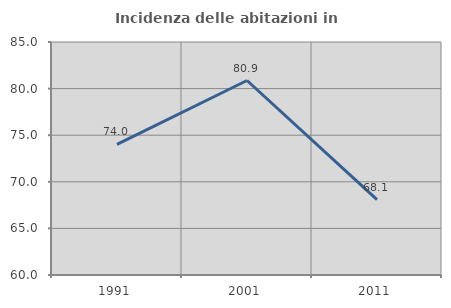
| Category | Incidenza delle abitazioni in proprietà  |
|---|---|
| 1991.0 | 74.017 |
| 2001.0 | 80.867 |
| 2011.0 | 68.095 |